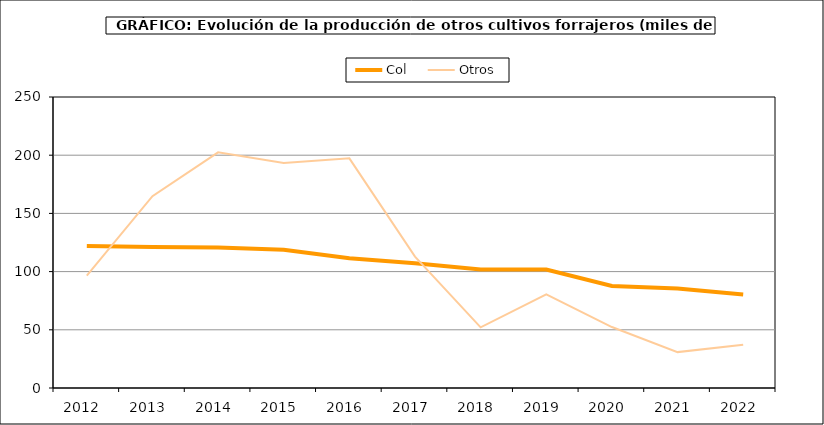
| Category | Col | Otros |
|---|---|---|
| 2012.0 | 122.008 | 96.567 |
| 2013.0 | 121.043 | 164.745 |
| 2014.0 | 120.638 | 202.445 |
| 2015.0 | 118.726 | 193.293 |
| 2016.0 | 111.472 | 197.303 |
| 2017.0 | 107.156 | 112.906 |
| 2018.0 | 101.713 | 52.117 |
| 2019.0 | 101.713 | 80.354 |
| 2020.0 | 87.632 | 52.373 |
| 2021.0 | 85.488 | 30.83 |
| 2022.0 | 80.418 | 37.165 |